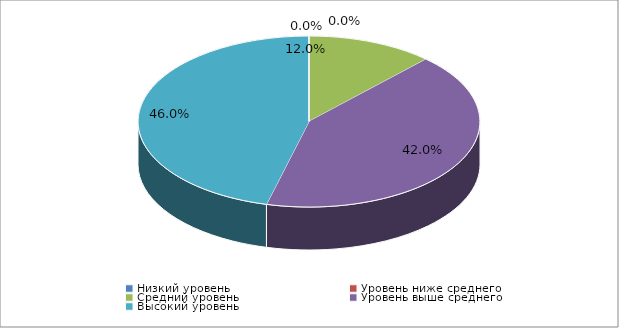
| Category | Series 0 |
|---|---|
| Низкий уровень | 0 |
| Уровень ниже среднего | 0 |
| Средний уровень | 0.12 |
| Уровень выше среднего | 0.42 |
| Высокий уровень | 0.46 |